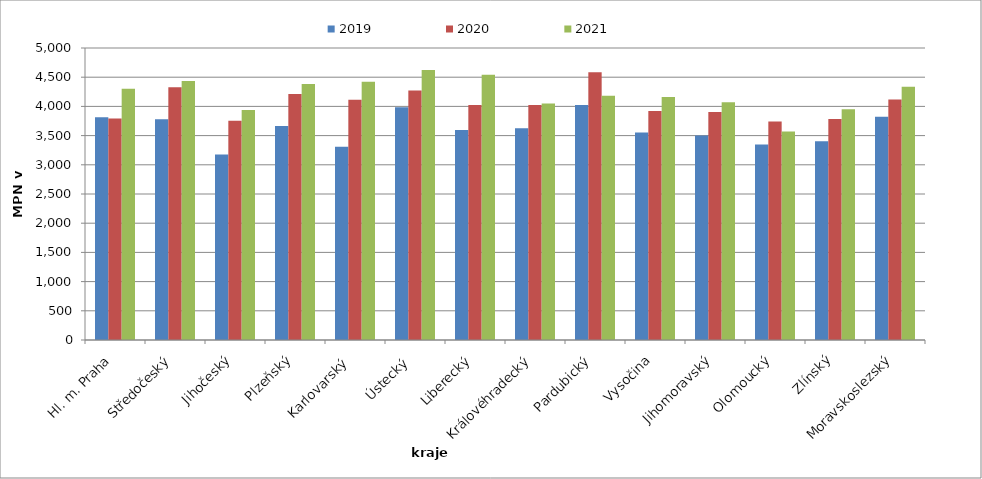
| Category | 2019 | 2020 | 2021 |
|---|---|---|---|
| Hl. m. Praha | 3815 | 3793 | 4302 |
| Středočeský | 3778 | 4328 | 4437 |
| Jihočeský | 3177 | 3753 | 3937 |
| Plzeňský | 3663 | 4214 | 4385 |
| Karlovarský  | 3311 | 4112 | 4421 |
| Ústecký   | 3985 | 4273 | 4623 |
| Liberecký | 3597 | 4022 | 4543 |
| Královéhradecký | 3626 | 4024 | 4050 |
| Pardubický | 4023 | 4586 | 4183 |
| Vysočina | 3555 | 3923 | 4163 |
| Jihomoravský | 3500 | 3903 | 4073 |
| Olomoucký | 3347 | 3742 | 3569 |
| Zlínský | 3404 | 3786 | 3952 |
| Moravskoslezský | 3822 | 4118 | 4338 |